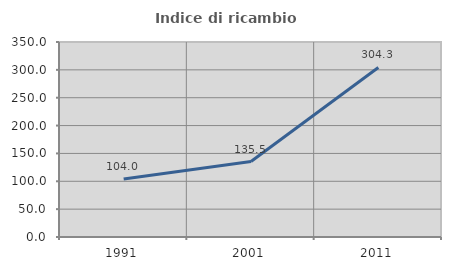
| Category | Indice di ricambio occupazionale  |
|---|---|
| 1991.0 | 104.011 |
| 2001.0 | 135.452 |
| 2011.0 | 304.337 |